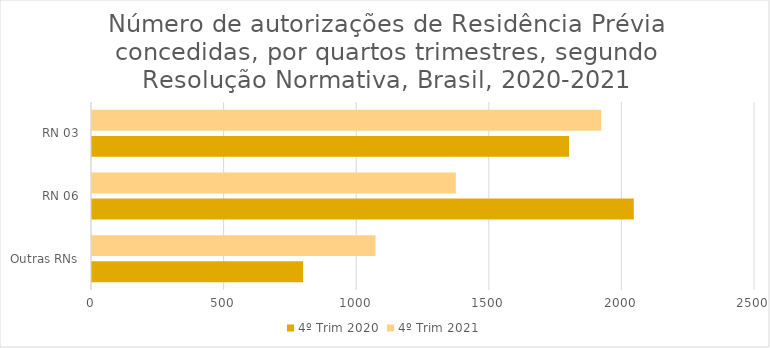
| Category | 4º Trim 2020 | 4º Trim 2021 |
|---|---|---|
| Outras RNs | 796 | 1069 |
| RN 06 | 2043 | 1372 |
| RN 03 | 1799 | 1920 |